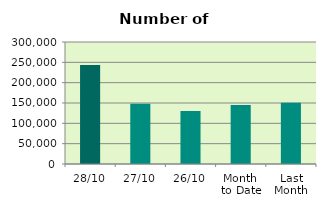
| Category | Series 0 |
|---|---|
| 28/10 | 243574 |
| 27/10 | 148330 |
| 26/10 | 130030 |
| Month 
to Date | 145229.5 |
| Last
Month | 150562.364 |